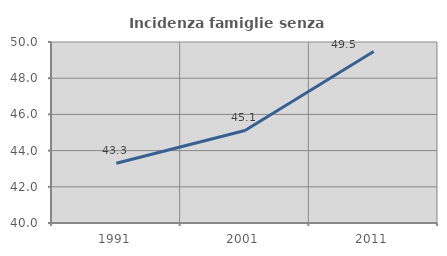
| Category | Incidenza famiglie senza nuclei |
|---|---|
| 1991.0 | 43.299 |
| 2001.0 | 45.113 |
| 2011.0 | 49.477 |